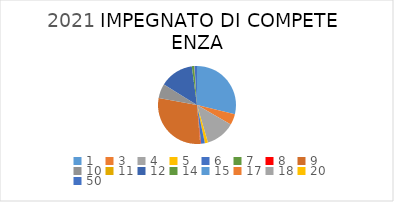
| Category | Series 0 |
|---|---|
| 1.0 | 2616964.58 |
| 3.0 | 413423 |
| 4.0 | 1103617.48 |
| 5.0 | 118341.4 |
| 6.0 | 138165.94 |
| 7.0 | 15300 |
| 8.0 | 21031.02 |
| 9.0 | 2653429.15 |
| 10.0 | 535096.37 |
| 11.0 | 7333.34 |
| 12.0 | 1274473.12 |
| 14.0 | 89411.55 |
| 15.0 | 3857.23 |
| 17.0 | 6954 |
| 18.0 | 3000 |
| 20.0 | 0 |
| 50.0 | 91258.46 |